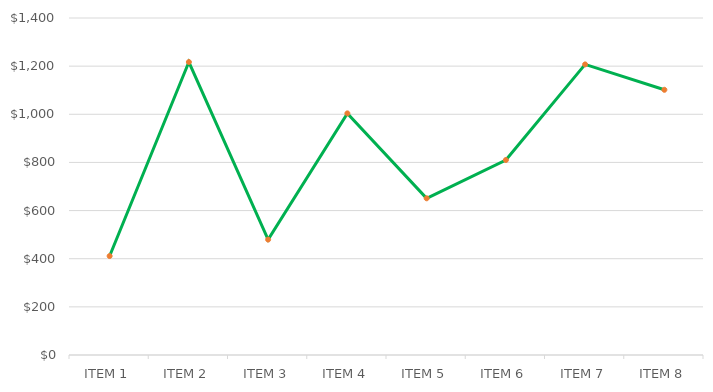
| Category | Series 1 |
|---|---|
| ITEM 1 | 411.07 |
| ITEM 2 | 1217.065 |
| ITEM 3 | 479.5 |
| ITEM 4 | 1003.75 |
| ITEM 5 | 651 |
| ITEM 6 | 810 |
| ITEM 7 | 1207.25 |
| ITEM 8 | 1101.76 |